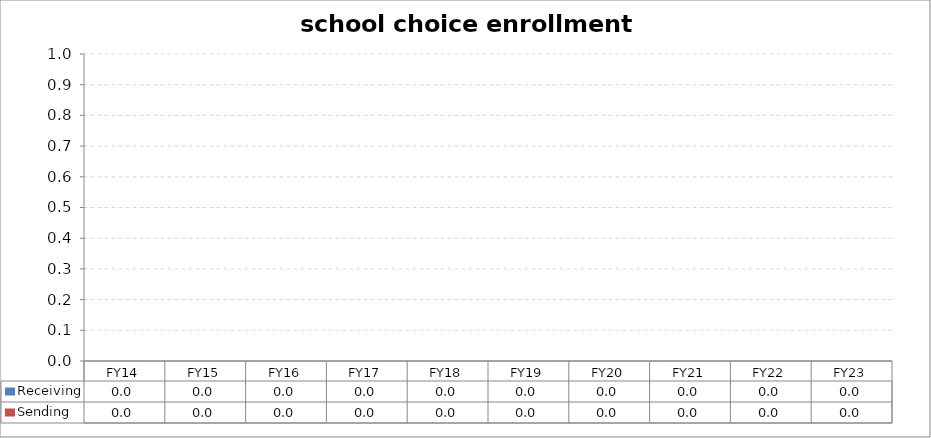
| Category | Receiving | Sending |
|---|---|---|
| FY14 | 0 | 0 |
| FY15 | 0 | 0 |
| FY16 | 0 | 0 |
| FY17 | 0 | 0 |
| FY18 | 0 | 0 |
| FY19 | 0 | 0 |
| FY20 | 0 | 0 |
| FY21 | 0 | 0 |
| FY22 | 0 | 0 |
| FY23 | 0 | 0 |